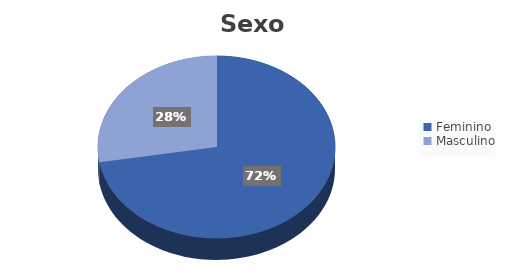
| Category | Series 0 |
|---|---|
| Feminino | 0.723 |
| Masculino | 0.277 |